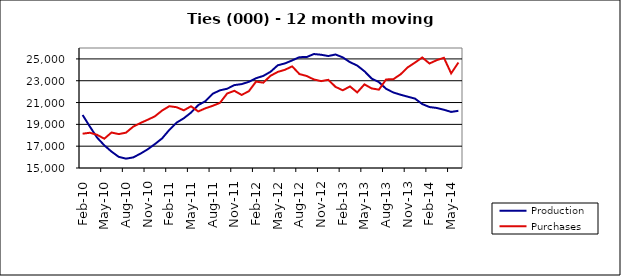
| Category | Production | Purchases |
|---|---|---|
| 2006-02-01 | 19860.435 | 18142.822 |
| 2006-03-01 | 18798.577 | 18231.973 |
| 2006-04-01 | 17788.895 | 18042.422 |
| 2006-05-01 | 17077.542 | 17685.593 |
| 2006-06-01 | 16503.382 | 18253.454 |
| 2006-07-01 | 16020.404 | 18107.794 |
| 2006-08-01 | 15856.582 | 18239.4 |
| 2006-09-01 | 15970.325 | 18788.04 |
| 2006-10-01 | 16313.459 | 19124.813 |
| 2006-11-01 | 16710.849 | 19421.05 |
| 2006-12-01 | 17190.1 | 19735.982 |
| 2007-01-01 | 17714.519 | 20267.368 |
| 2007-02-01 | 18495.045 | 20662.733 |
| 2007-03-01 | 19156.284 | 20573.808 |
| 2007-04-01 | 19557.491 | 20287.484 |
| 2007-05-01 | 20077.898 | 20655.189 |
| 2007-06-01 | 20765.665 | 20185.167 |
| 2007-07-01 | 21128.425 | 20475.06 |
| 2007-08-01 | 21807.194 | 20700.175 |
| 2007-09-01 | 22118.818 | 20969.137 |
| 2007-10-01 | 22265.055 | 21828.66 |
| 2007-11-01 | 22598.415 | 22076.202 |
| 2007-12-01 | 22689.418 | 21699.581 |
| 2008-01-01 | 22897.671 | 22034.885 |
| 2008-02-01 | 23231.411 | 22917.926 |
| 2008-03-01 | 23440.859 | 22823.2 |
| 2008-04-01 | 23818.515 | 23452.563 |
| 2008-05-01 | 24413.871 | 23806.877 |
| 2008-06-01 | 24588.394 | 24003.444 |
| 2008-07-01 | 24861.032 | 24316.991 |
| 2008-08-01 | 25161.729 | 23613.628 |
| 2008-09-01 | 25167.17 | 23434.252 |
| 2008-10-01 | 25447.846 | 23117.15 |
| 2008-11-01 | 25381.393 | 22963.606 |
| 2008-12-01 | 25264.451 | 23081.551 |
| 2009-01-01 | 25405.25 | 22435.959 |
| 2009-02-01 | 25140.11 | 22122.495 |
| 2009-03-01 | 24700.704 | 22476.498 |
| 2009-04-01 | 24392.196 | 21929.786 |
| 2009-05-01 | 23867.507 | 22666.032 |
| 2009-06-01 | 23197.845 | 22295.532 |
| 2009-07-01 | 22875.331 | 22180.968 |
| 2009-08-01 | 22255.465 | 23119.766 |
| 2009-09-01 | 21921.342 | 23138.87 |
| 2009-10-01 | 21717.58 | 23588.791 |
| 2009-11-01 | 21535.364 | 24231.321 |
| 2009-12-01 | 21359.765 | 24664.451 |
| 2010-01-01 | 20861.327 | 25131.231 |
| 2010-02-01 | 20587.907 | 24577.817 |
| 2010-03-01 | 20504.788 | 24884.209 |
| 2010-04-01 | 20340.152 | 25100.818 |
| 2010-05-01 | 20140.75 | 23672.19 |
| 2010-06-01 | 20242.709 | 24666.211 |